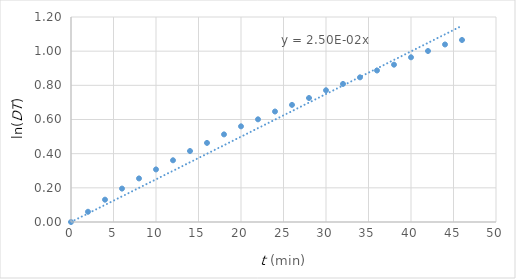
| Category | ln(DT) |
|---|---|
| 0.0 | 0 |
| 2.0 | 0.06 |
| 4.0 | 0.131 |
| 6.0 | 0.196 |
| 8.0 | 0.255 |
| 10.0 | 0.308 |
| 12.0 | 0.361 |
| 14.0 | 0.415 |
| 16.0 | 0.463 |
| 18.0 | 0.513 |
| 20.0 | 0.56 |
| 22.0 | 0.601 |
| 24.0 | 0.647 |
| 26.0 | 0.686 |
| 28.0 | 0.726 |
| 30.0 | 0.771 |
| 32.0 | 0.808 |
| 34.0 | 0.847 |
| 36.0 | 0.887 |
| 38.0 | 0.921 |
| 40.0 | 0.964 |
| 42.0 | 1.001 |
| 44.0 | 1.039 |
| 46.0 | 1.065 |